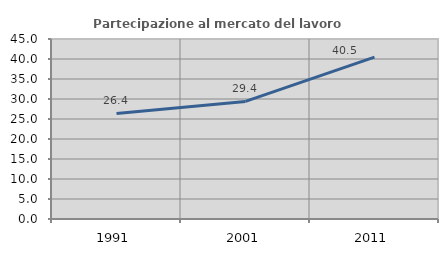
| Category | Partecipazione al mercato del lavoro  femminile |
|---|---|
| 1991.0 | 26.389 |
| 2001.0 | 29.387 |
| 2011.0 | 40.467 |